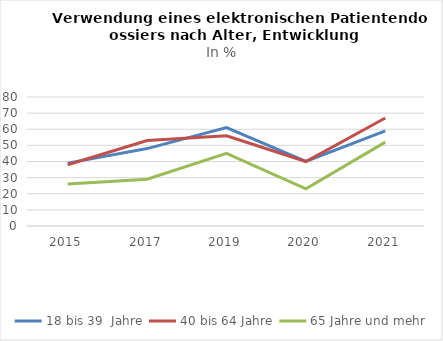
| Category | 18 bis 39  Jahre | 40 bis 64 Jahre | 65 Jahre und mehr |
|---|---|---|---|
| 2015.0 | 39 | 38 | 26 |
| 2017.0 | 48 | 53 | 29 |
| 2019.0 | 61 | 56 | 45 |
| 2020.0 | 40 | 40 | 23 |
| 2021.0 | 59 | 67 | 52 |